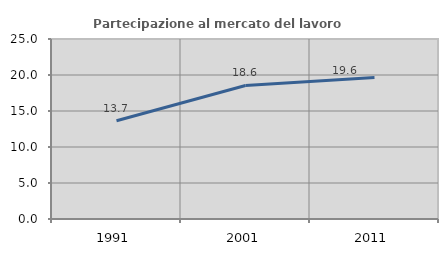
| Category | Partecipazione al mercato del lavoro  femminile |
|---|---|
| 1991.0 | 13.653 |
| 2001.0 | 18.55 |
| 2011.0 | 19.639 |